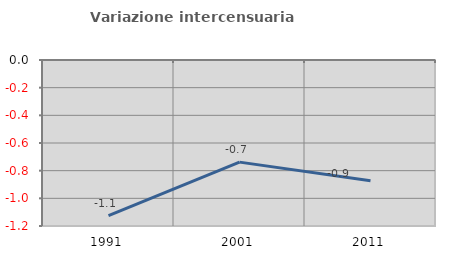
| Category | Variazione intercensuaria annua |
|---|---|
| 1991.0 | -1.124 |
| 2001.0 | -0.738 |
| 2011.0 | -0.872 |